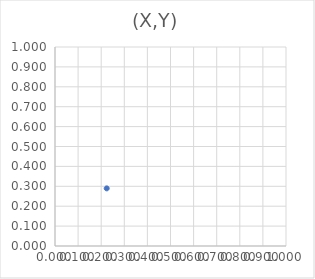
| Category | (X,Y) |
|---|---|
| 0.223800149191845 | 0.29 |